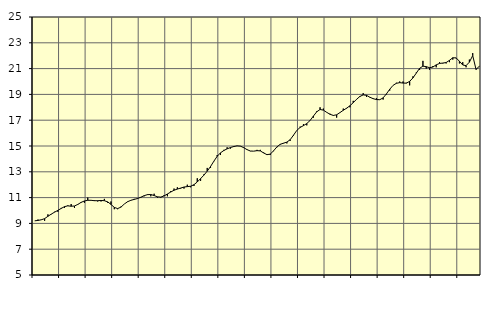
| Category | Piggar | Finansiell verksamhet, företagstjänster, SNI 64-82 |
|---|---|---|
| nan | 9.2 | 9.2 |
| 87.0 | 9.3 | 9.23 |
| 87.0 | 9.3 | 9.28 |
| 87.0 | 9.2 | 9.37 |
| nan | 9.7 | 9.55 |
| 88.0 | 9.7 | 9.72 |
| 88.0 | 9.9 | 9.87 |
| 88.0 | 9.9 | 10.01 |
| nan | 10.2 | 10.16 |
| 89.0 | 10.2 | 10.3 |
| 89.0 | 10.4 | 10.36 |
| 89.0 | 10.5 | 10.33 |
| nan | 10.2 | 10.35 |
| 90.0 | 10.5 | 10.47 |
| 90.0 | 10.6 | 10.63 |
| 90.0 | 10.6 | 10.74 |
| nan | 11 | 10.79 |
| 91.0 | 10.8 | 10.79 |
| 91.0 | 10.8 | 10.76 |
| 91.0 | 10.7 | 10.76 |
| nan | 10.7 | 10.78 |
| 92.0 | 10.9 | 10.76 |
| 92.0 | 10.6 | 10.67 |
| 92.0 | 10.7 | 10.47 |
| nan | 10.1 | 10.24 |
| 93.0 | 10.1 | 10.15 |
| 93.0 | 10.3 | 10.26 |
| 93.0 | 10.5 | 10.5 |
| nan | 10.7 | 10.68 |
| 94.0 | 10.8 | 10.79 |
| 94.0 | 10.9 | 10.86 |
| 94.0 | 10.9 | 10.93 |
| nan | 11 | 11.03 |
| 95.0 | 11.1 | 11.15 |
| 95.0 | 11.2 | 11.23 |
| 95.0 | 11.1 | 11.24 |
| nan | 11.3 | 11.16 |
| 96.0 | 11 | 11.06 |
| 96.0 | 11 | 11.04 |
| 96.0 | 11.2 | 11.13 |
| nan | 11.1 | 11.28 |
| 97.0 | 11.5 | 11.43 |
| 97.0 | 11.7 | 11.57 |
| 97.0 | 11.8 | 11.66 |
| nan | 11.7 | 11.74 |
| 98.0 | 11.7 | 11.82 |
| 98.0 | 12 | 11.85 |
| 98.0 | 11.8 | 11.88 |
| nan | 11.9 | 12 |
| 99.0 | 12.5 | 12.21 |
| 99.0 | 12.3 | 12.47 |
| 99.0 | 12.8 | 12.74 |
| nan | 13.3 | 13.05 |
| 0.0 | 13.3 | 13.41 |
| 0.0 | 13.8 | 13.82 |
| 0.0 | 14.3 | 14.2 |
| nan | 14.3 | 14.47 |
| 1.0 | 14.7 | 14.65 |
| 1.0 | 14.9 | 14.78 |
| 1.0 | 14.8 | 14.88 |
| nan | 15 | 14.96 |
| 2.0 | 15 | 15.01 |
| 2.0 | 15 | 14.99 |
| 2.0 | 14.9 | 14.87 |
| nan | 14.7 | 14.72 |
| 3.0 | 14.6 | 14.61 |
| 3.0 | 14.6 | 14.6 |
| 3.0 | 14.7 | 14.64 |
| nan | 14.7 | 14.62 |
| 4.0 | 14.5 | 14.46 |
| 4.0 | 14.3 | 14.33 |
| 4.0 | 14.3 | 14.37 |
| nan | 14.6 | 14.63 |
| 5.0 | 14.9 | 14.93 |
| 5.0 | 15.1 | 15.13 |
| 5.0 | 15.2 | 15.22 |
| nan | 15.2 | 15.3 |
| 6.0 | 15.4 | 15.49 |
| 6.0 | 15.8 | 15.84 |
| 6.0 | 16.2 | 16.21 |
| nan | 16.5 | 16.44 |
| 7.0 | 16.7 | 16.58 |
| 7.0 | 16.6 | 16.74 |
| 7.0 | 17 | 16.98 |
| nan | 17.2 | 17.32 |
| 8.0 | 17.7 | 17.65 |
| 8.0 | 18 | 17.83 |
| 8.0 | 17.9 | 17.78 |
| nan | 17.6 | 17.61 |
| 9.0 | 17.5 | 17.46 |
| 9.0 | 17.4 | 17.37 |
| 9.0 | 17.2 | 17.42 |
| nan | 17.6 | 17.59 |
| 10.0 | 17.9 | 17.77 |
| 10.0 | 17.9 | 17.93 |
| 10.0 | 18 | 18.12 |
| nan | 18.5 | 18.36 |
| 11.0 | 18.6 | 18.62 |
| 11.0 | 18.8 | 18.84 |
| 11.0 | 19.1 | 18.96 |
| nan | 18.8 | 18.93 |
| 12.0 | 18.8 | 18.78 |
| 12.0 | 18.7 | 18.67 |
| 12.0 | 18.7 | 18.6 |
| nan | 18.6 | 18.59 |
| 13.0 | 18.6 | 18.73 |
| 13.0 | 19 | 19.04 |
| 13.0 | 19.3 | 19.4 |
| nan | 19.7 | 19.7 |
| 14.0 | 19.9 | 19.86 |
| 14.0 | 20 | 19.91 |
| 14.0 | 20 | 19.88 |
| nan | 19.9 | 19.87 |
| 15.0 | 19.7 | 20.01 |
| 15.0 | 20.4 | 20.28 |
| 15.0 | 20.7 | 20.65 |
| nan | 20.9 | 21.02 |
| 16.0 | 21.6 | 21.19 |
| 16.0 | 21 | 21.15 |
| 16.0 | 20.9 | 21.07 |
| nan | 21.2 | 21.12 |
| 17.0 | 21.1 | 21.29 |
| 17.0 | 21.5 | 21.4 |
| 17.0 | 21.4 | 21.43 |
| nan | 21.4 | 21.47 |
| 18.0 | 21.5 | 21.64 |
| 18.0 | 21.7 | 21.84 |
| 18.0 | 21.8 | 21.83 |
| nan | 21.4 | 21.57 |
| 19.0 | 21.5 | 21.28 |
| 19.0 | 21.1 | 21.23 |
| 19.0 | 21.7 | 21.5 |
| nan | 22.2 | 22.01 |
| 20.0 | 20.9 | 20.94 |
| 20.0 | 21.2 | 21.18 |